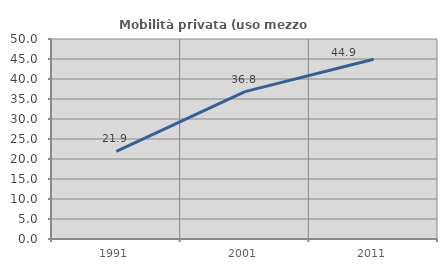
| Category | Mobilità privata (uso mezzo privato) |
|---|---|
| 1991.0 | 21.92 |
| 2001.0 | 36.842 |
| 2011.0 | 44.944 |